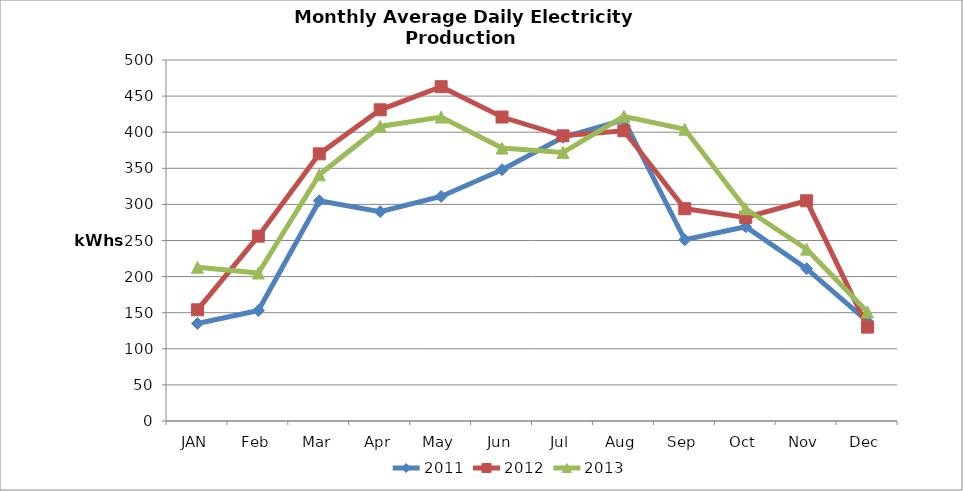
| Category | 2011 | 2012 | 2013 |
|---|---|---|---|
| JAN | 135 | 154 | 213 |
| Feb | 153 | 256 | 205 |
| Mar | 305 | 370 | 341 |
| Apr | 290 | 431 | 408 |
| May | 311 | 463 | 421 |
| Jun | 348 | 421 | 378 |
| Jul | 393 | 395 | 372 |
| Aug | 417 | 402 | 422 |
| Sep | 251 | 294 | 404 |
| Oct | 269 | 282 | 294 |
| Nov | 211 | 305 | 238 |
| Dec | 138 | 130 | 151 |